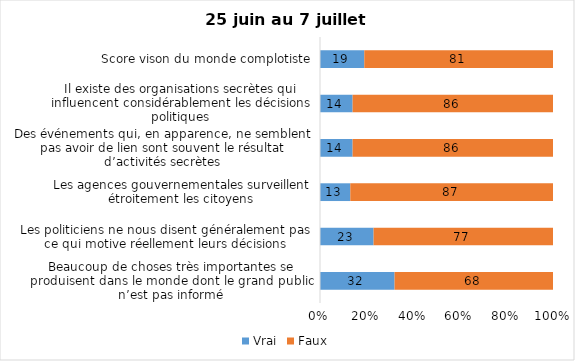
| Category | Vrai | Faux |
|---|---|---|
| Beaucoup de choses très importantes se produisent dans le monde dont le grand public n’est pas informé | 32 | 68 |
| Les politiciens ne nous disent généralement pas ce qui motive réellement leurs décisions | 23 | 77 |
| Les agences gouvernementales surveillent étroitement les citoyens | 13 | 87 |
| Des événements qui, en apparence, ne semblent pas avoir de lien sont souvent le résultat d’activités secrètes | 14 | 86 |
| Il existe des organisations secrètes qui influencent considérablement les décisions politiques | 14 | 86 |
| Score vison du monde complotiste | 19 | 81 |